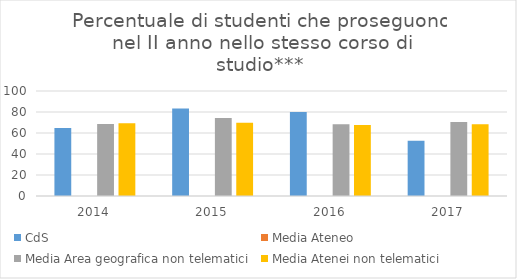
| Category | CdS | Media Ateneo | Media Area geografica non telematici | Media Atenei non telematici |
|---|---|---|---|---|
| 2014.0 | 64.7 |  | 68.5 | 69.4 |
| 2015.0 | 83.3 |  | 74.2 | 69.7 |
| 2016.0 | 80 |  | 68.3 | 67.6 |
| 2017.0 | 52.6 |  | 70.4 | 68.3 |